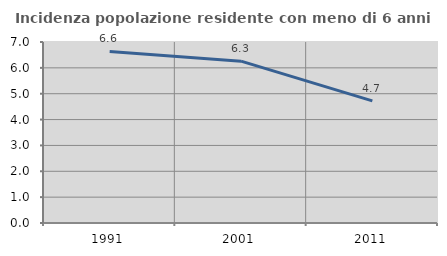
| Category | Incidenza popolazione residente con meno di 6 anni |
|---|---|
| 1991.0 | 6.633 |
| 2001.0 | 6.258 |
| 2011.0 | 4.721 |